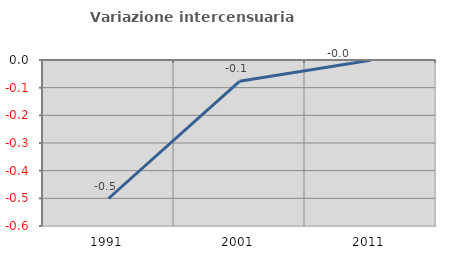
| Category | Variazione intercensuaria annua |
|---|---|
| 1991.0 | -0.501 |
| 2001.0 | -0.077 |
| 2011.0 | -0.001 |